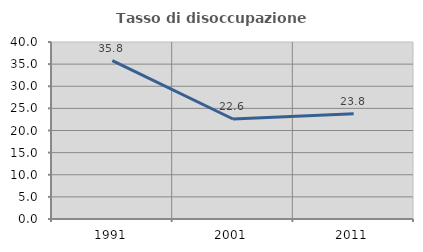
| Category | Tasso di disoccupazione giovanile  |
|---|---|
| 1991.0 | 35.769 |
| 2001.0 | 22.594 |
| 2011.0 | 23.783 |